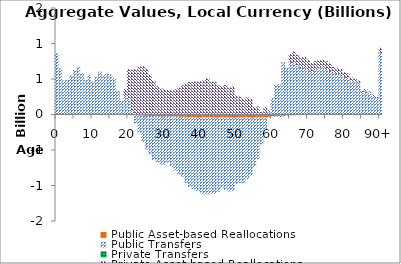
| Category | Public Asset-based Reallocations | Public Transfers | Private Transfers | Private Asset-based Reallocations |
|---|---|---|---|---|
| 0 | -1.438 | 861.43 |  | 0 |
|  | -1.44 | 647.722 |  | 0 |
| 2 | -1.421 | 479.377 |  | 0 |
| 3 | -1.457 | 490.05 |  | 0 |
| 4 | -1.507 | 551.257 |  | 0 |
| 5 | -1.601 | 626.656 |  | 0 |
| 6 | -1.652 | 674.514 |  | 0 |
| 7 | -1.804 | 581.235 |  | 0 |
| 8 | -1.937 | 489.292 |  | 0 |
| 9 | -2.135 | 558.306 |  | 0 |
| 10 | -2.324 | 469.206 |  | 0 |
| 11 | -2.441 | 524.595 |  | 0 |
| 12 | -2.644 | 603.091 |  | 0 |
| 13 | -2.715 | 558.234 |  | 0 |
| 14 | -2.826 | 578.814 |  | 0 |
| 15 | -3.023 | 563.935 |  | 0 |
| 16 | -3.26 | 514.165 |  | 0 |
| 17 | -4.338 | 336.035 |  | 0 |
| 18 | -4.48 | 191.856 |  | -2.445 |
| 19 | -5.023 | 260.234 |  | 97.086 |
| 20 | -7.542 | 217.643 |  | 423.191 |
| 21 | -10.937 | 50.827 |  | 580.502 |
| 22 | -12.918 | -112.565 |  | 640.256 |
| 23 | -14.105 | -243.119 |  | 680.474 |
| 24 | -16.044 | -365.063 |  | 682.055 |
| 25 | -18.566 | -474.685 |  | 648.645 |
| 26 | -21.251 | -545.469 |  | 561.705 |
| 27 | -23.903 | -621.045 |  | 475.45 |
| 28 | -26.092 | -647.134 |  | 401.235 |
| 29 | -27.293 | -677.679 |  | 365.411 |
| 30 | -27.087 | -677.129 |  | 357.013 |
| 31 | -25.492 | -651.637 |  | 347.184 |
| 32 | -26.857 | -710.334 |  | 340.881 |
| 33 | -28.508 | -760.786 |  | 357.219 |
| 34 | -30.004 | -814.082 |  | 378.161 |
| 35 | -31.323 | -844.475 |  | 411.938 |
| 36 | -34.338 | -928.968 |  | 437.431 |
| 37 | -36.23 | -983.683 |  | 456.486 |
| 38 | -37.092 | -1014.322 |  | 462.014 |
| 39 | -37.735 | -1038.622 |  | 463.394 |
| 40 | -38.993 | -1058.734 |  | 466.895 |
| 41 | -40.027 | -1083.672 |  | 484.516 |
| 42 | -40.07 | -1085.821 |  | 511.043 |
| 43 | -40.328 | -1072.323 |  | 463.983 |
| 44 | -40.349 | -1078.394 |  | 461.645 |
| 45 | -40.434 | -1047.426 |  | 410.276 |
| 46 | -39.492 | -996.872 |  | 402.525 |
| 47 | -41.172 | -1027.706 |  | 414.429 |
| 48 | -42.596 | -1041.615 |  | 382.419 |
| 49 | -42.209 | -1033.541 |  | 397.107 |
| 50 | -41.834 | -937.99 |  | 268.585 |
| 51 | -41.102 | -924.041 |  | 254.922 |
| 52 | -42.222 | -927.067 |  | 224.319 |
| 53 | -40.898 | -870.773 |  | 241.784 |
| 54 | -41.338 | -821.238 |  | 222.173 |
| 55 | -42.485 | -696.87 |  | 106.378 |
| 56 | -42.431 | -587.341 |  | 115.444 |
| 57 | -41.537 | -380.012 |  | 36.033 |
| 58 | -38.392 | -173.697 |  | 108.996 |
| 59 | -33.307 | 30.156 |  | 36.993 |
| 60 | -25.073 | 227.271 |  | 0.625 |
| 61 | -20.893 | 419.81 |  | -11.44 |
| 62 | -15.488 | 427.419 |  | -19.68 |
| 63 | -19.2 | 736.68 |  | -6.801 |
| 64 | -12.155 | 658.615 |  | -2.779 |
| 65 | -11.927 | 741.852 |  | 111.077 |
| 66 | -10.274 | 723.943 |  | 164.606 |
| 67 | -9.124 | 685.653 |  | 155.806 |
| 68 | -8.263 | 656.059 |  | 150.608 |
| 69 | -7.949 | 671.263 |  | 141.292 |
| 70 | -7.343 | 620.697 |  | 151.342 |
| 71 | -6.674 | 591.248 |  | 133.076 |
| 72 | -6.805 | 624.422 |  | 126.31 |
| 73 | -6.537 | 648.95 |  | 115.76 |
| 74 | -6.218 | 667.2 |  | 104.279 |
| 75 | -5.773 | 625.077 |  | 124.426 |
| 76 | -5.361 | 612.583 |  | 108.034 |
| 77 | -4.771 | 578.457 |  | 91.747 |
| 78 | -4.453 | 572.886 |  | 81.697 |
| 79 | -4.18 | 561.428 |  | 78.48 |
| 80 | -3.734 | 531.867 |  | 63.118 |
| 81 | -3.407 | 515.29 |  | 61.603 |
| 82 | -2.946 | 466.395 |  | 55.588 |
| 83 | -2.718 | 452.755 |  | 51.552 |
| 84 | -2.475 | 431.571 |  | 50.353 |
| 85 | -1.65 | 303.091 |  | 30.155 |
| 86 | -1.68 | 326.157 |  | 32.377 |
| 87 | -1.442 | 293.933 |  | 29.328 |
| 88 | -1.197 | 253.97 |  | 24.773 |
| 89 | -1.011 | 227.604 |  | 21.694 |
| 90+ | -3.279 | 863.157 |  | 77.938 |